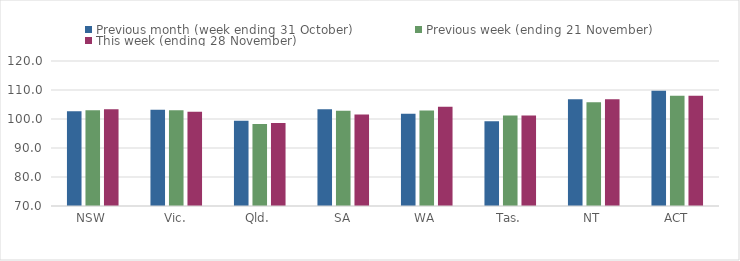
| Category | Previous month (week ending 31 October) | Previous week (ending 21 November) | This week (ending 28 November) |
|---|---|---|---|
| NSW | 102.65 | 102.98 | 103.37 |
| Vic. | 103.19 | 103 | 102.52 |
| Qld. | 99.41 | 98.25 | 98.61 |
| SA | 103.39 | 102.85 | 101.51 |
| WA | 101.83 | 102.96 | 104.25 |
| Tas. | 99.24 | 101.19 | 101.17 |
| NT | 106.85 | 105.8 | 106.8 |
| ACT | 109.77 | 108 | 108 |